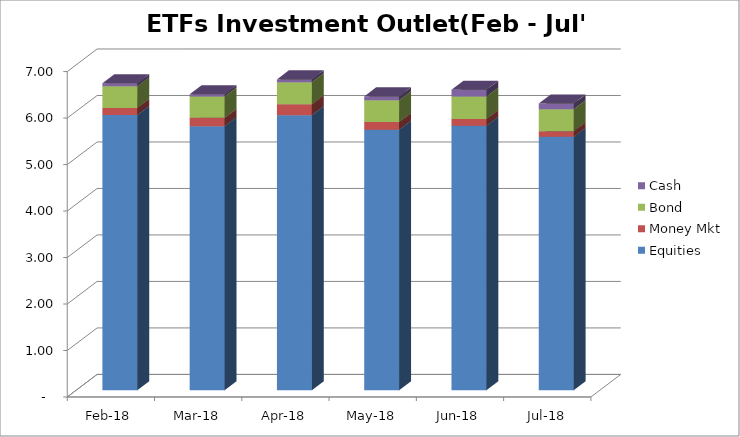
| Category | Equities | Money Mkt | Bond | Cash |
|---|---|---|---|---|
| 2018-02-01 | 5921870729.43 | 151252495.1 | 464176980.34 | 64897422.63 |
| 2018-03-01 | 5680580702.11 | 178223610.44 | 461242108.34 | 47114040.72 |
| 2018-04-01 | 5916812401.32 | 236436196.19 | 473183326.33 | 59989270.56 |
| 2018-05-01 | 5604937403.21 | 163325823.53 | 470433442.99 | 82279978.28 |
| 2018-06-01 | 5688266618.66 | 146073161.64 | 483544793.6 | 144539302.66 |
| 2018-07-01 | 5450573222.74 | 120602888.23 | 474827704.85 | 119719492.83 |